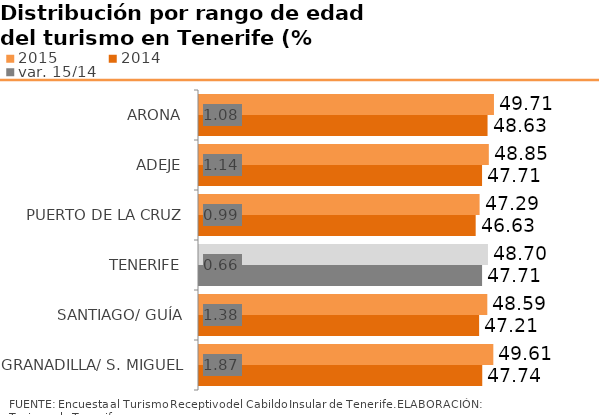
| Category | 2015 | 2014 |
|---|---|---|
| ARONA | 49.712 | 48.632 |
| ADEJE | 48.848 | 47.705 |
| PUERTO DE LA CRUZ | 47.293 | 46.632 |
| TENERIFE | 48.704 | 47.709 |
| SANTIAGO/ GUÍA | 48.592 | 47.211 |
| GRANADILLA/ S. MIGUEL | 49.607 | 47.739 |